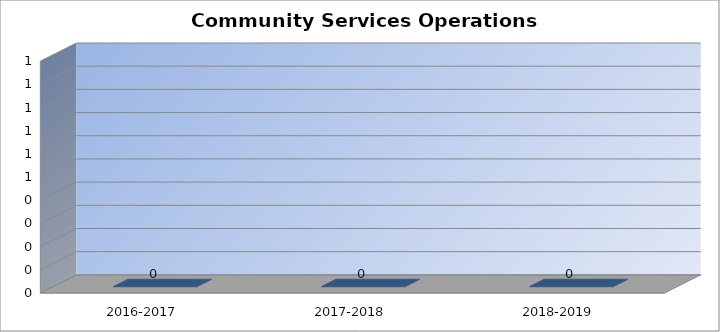
| Category | Community Services Operations Expenses |
|---|---|
| 2016-2017 | 0 |
| 2017-2018 | 0 |
| 2018-2019 | 0 |